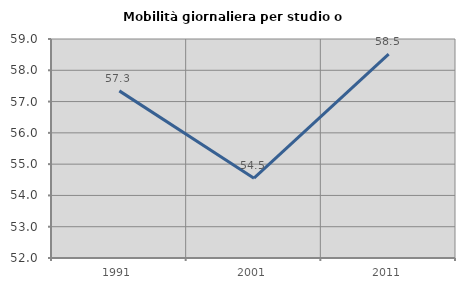
| Category | Mobilità giornaliera per studio o lavoro |
|---|---|
| 1991.0 | 57.342 |
| 2001.0 | 54.55 |
| 2011.0 | 58.518 |